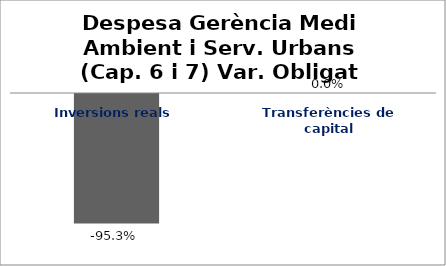
| Category | Series 0 |
|---|---|
| Inversions reals | -0.953 |
| Transferències de capital | 0 |